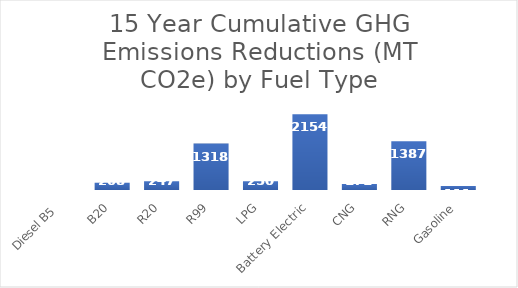
| Category | Series 0 |
|---|---|
| Diesel B5  | 0 |
| B20 | 208.036 |
| R20 | 247.232 |
| R99 | 1318.317 |
| LPG | 249.782 |
| Battery Electric | 2153.641 |
| CNG | 171.224 |
| RNG | 1387.492 |
| Gasoline | 110.54 |